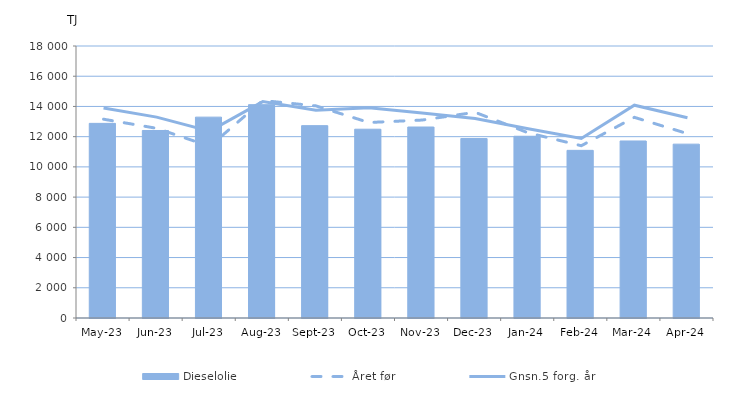
| Category | Dieselolie |
|---|---|
| 2023-05-01 | 12879.661 |
| 2023-06-01 | 12408.786 |
| 2023-07-01 | 13292.286 |
| 2023-08-01 | 14117.86 |
| 2023-09-01 | 12729.876 |
| 2023-10-01 | 12492.968 |
| 2023-11-01 | 12638.843 |
| 2023-12-01 | 11875.823 |
| 2024-01-01 | 12027.078 |
| 2024-02-01 | 11094.654 |
| 2024-03-01 | 11714.955 |
| 2024-04-01 | 11504.804 |